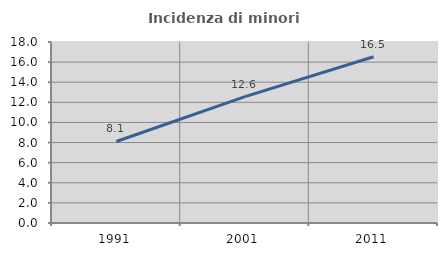
| Category | Incidenza di minori stranieri |
|---|---|
| 1991.0 | 8.108 |
| 2001.0 | 12.563 |
| 2011.0 | 16.527 |